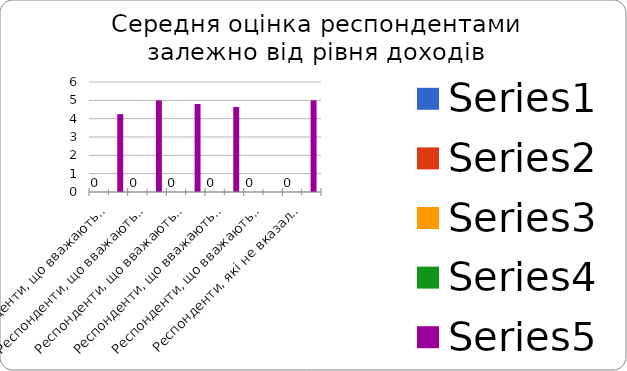
| Category | Series 0 | Series 1 | Series 2 | Series 3 | Series 4 |
|---|---|---|---|---|---|
| Респонденти, що вважають себе незаможними |  |  |  |  | 4.25 |
| Респонденти, що вважають своє матеріальне становище нижчим середнього |  |  |  |  | 5 |
| Респонденти, що вважають своє матеріальне становище середнім |  |  |  |  | 4.8 |
| Респонденти, що вважають своє матеріальне становище вищим середнього |  |  |  |  | 4.636 |
| Респонденти, що вважають себе заможними |  |  |  |  | 0 |
| Респонденти, які не вказали матеріальне становище своєї родини |  |  |  |  | 5 |